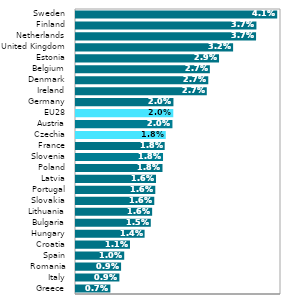
| Category |  Celkem 
(ISCO 25) |
|---|---|
| Greece | 0.007 |
| Italy | 0.009 |
| Romania | 0.009 |
| Spain | 0.01 |
| Croatia | 0.011 |
| Hungary | 0.014 |
| Bulgaria | 0.015 |
| Lithuania | 0.016 |
| Slovakia | 0.016 |
| Portugal | 0.016 |
| Latvia | 0.016 |
| Poland | 0.018 |
| Slovenia | 0.018 |
| France | 0.018 |
| Czechia | 0.018 |
| Austria | 0.02 |
| EU28 | 0.02 |
| Germany | 0.02 |
| Ireland | 0.027 |
| Denmark | 0.027 |
| Belgium | 0.027 |
| Estonia | 0.029 |
| United Kingdom | 0.032 |
| Netherlands | 0.037 |
| Finland | 0.037 |
| Sweden | 0.041 |